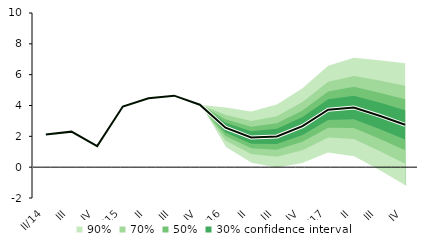
| Category | linka | Střed předpovědi |
|---|---|---|
| II/14 | 2.118 | 2.118 |
| III | 2.303 | 2.303 |
| IV | 1.363 | 1.363 |
| I/15 | 3.934 | 3.934 |
| II | 4.472 | 4.472 |
| III | 4.638 | 4.638 |
| IV | 4.05 | 4.05 |
| I/16 | 2.561 | 2.561 |
| II | 1.924 | 1.924 |
| III | 1.991 | 1.991 |
| IV | 2.663 | 2.663 |
| I/17 | 3.732 | 3.732 |
| II | 3.874 | 3.874 |
| III | 3.339 | 3.339 |
| IV | 2.748 | 2.748 |